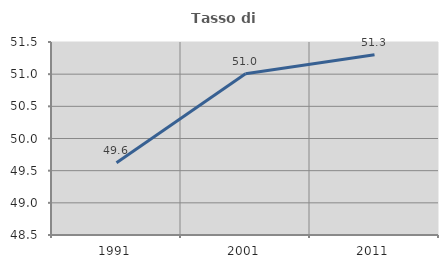
| Category | Tasso di occupazione   |
|---|---|
| 1991.0 | 49.623 |
| 2001.0 | 51.006 |
| 2011.0 | 51.303 |